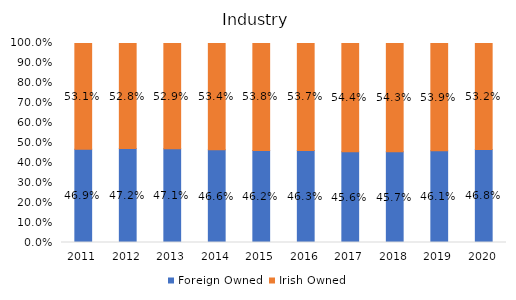
| Category | Foreign Owned | Irish Owned |
|---|---|---|
| 2011.0 | 0.469 | 0.531 |
| 2012.0 | 0.472 | 0.528 |
| 2013.0 | 0.471 | 0.529 |
| 2014.0 | 0.466 | 0.534 |
| 2015.0 | 0.462 | 0.538 |
| 2016.0 | 0.463 | 0.537 |
| 2017.0 | 0.456 | 0.544 |
| 2018.0 | 0.457 | 0.543 |
| 2019.0 | 0.461 | 0.539 |
| 2020.0 | 0.468 | 0.532 |